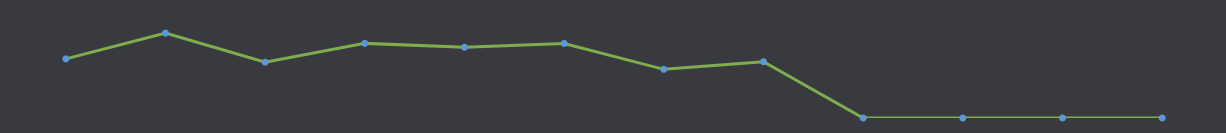
| Category | Tillgängliga kontanter |
|---|---|
| JAN | 5740 |
| FEB | 8239 |
| MAR | 5418 |
| APR | 7245 |
| MAJ | 6867 |
| JUN | 7238 |
| JUL | 4725 |
| AUG | 5467 |
| SEP | 0 |
| OKT | 0 |
| NOV | 0 |
| DEC | 0 |